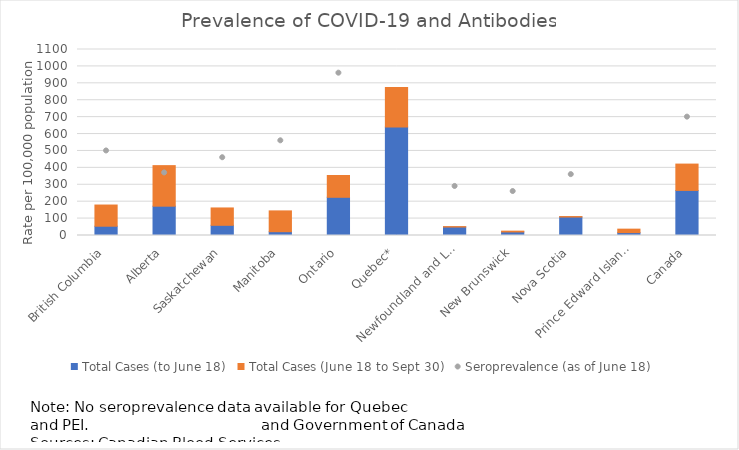
| Category | Total Cases (to June 18) | Total Cases (June 18 to Sept 30) |
|---|---|---|
| British Columbia | 54.88 | 125.31 |
| Alberta | 173.38 | 239.81 |
| Saskatchewan | 60.28 | 102.6 |
| Manitoba | 22.49 | 123.04 |
| Ontario | 225.98 | 129.01 |
| Quebec* | 640.93 | 234.6 |
| Newfoundland and Labrador | 50.04 | 2.5 |
| New Brunswick | 21.11 | 4.64 |
| Nova Scotia | 109.22 | 2.78 |
| Prince Edward Island* | 17.2 | 20.39 |
| Canada | 266.62 | 155.73 |